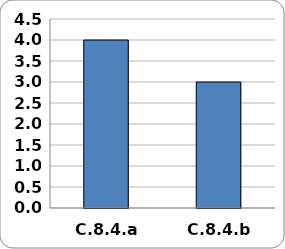
| Category | Series 0 |
|---|---|
| C.8.4.a. | 4 |
| C.8.4.b. | 3 |